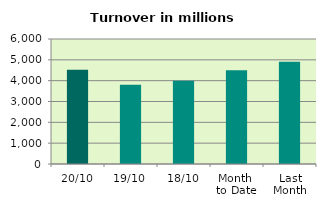
| Category | Series 0 |
|---|---|
| 20/10 | 4518.356 |
| 19/10 | 3807.943 |
| 18/10 | 3996.716 |
| Month 
to Date | 4503.973 |
| Last
Month | 4910.879 |